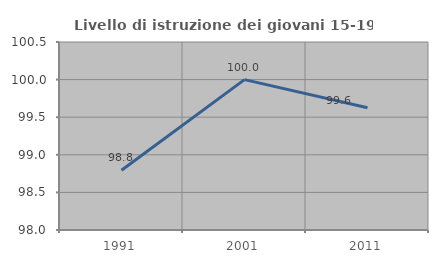
| Category | Livello di istruzione dei giovani 15-19 anni |
|---|---|
| 1991.0 | 98.795 |
| 2001.0 | 100 |
| 2011.0 | 99.625 |